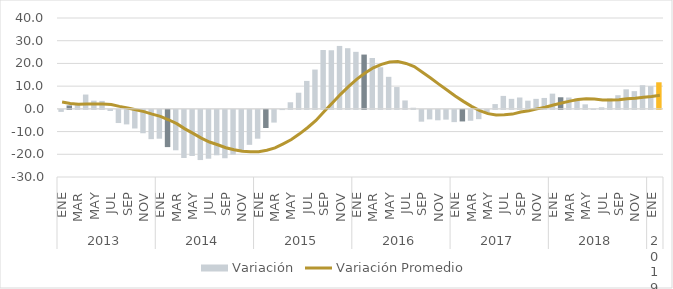
| Category | Variación |
|---|---|
| 0 | -0.9 |
| 1 | 1.5 |
| 2 | 2.5 |
| 3 | 6.3 |
| 4 | 3.6 |
| 5 | 3.5 |
| 6 | -0.5 |
| 7 | -5.8 |
| 8 | -6.4 |
| 9 | -8.2 |
| 10 | -10.3 |
| 11 | -12.9 |
| 12 | -12.7 |
| 13 | -16.4 |
| 14 | -17.8 |
| 15 | -21.2 |
| 16 | -20.3 |
| 17 | -22.1 |
| 18 | -21.5 |
| 19 | -20 |
| 20 | -21.3 |
| 21 | -19.7 |
| 22 | -18.2 |
| 23 | -15.4 |
| 24 | -12.7 |
| 25 | -8 |
| 26 | -5.6 |
| 27 | -0.1 |
| 28 | 2.9 |
| 29 | 7.1 |
| 30 | 12.3 |
| 31 | 17.3 |
| 32 | 25.9 |
| 33 | 25.8 |
| 34 | 27.7 |
| 35 | 26.7 |
| 36 | 25.1 |
| 37 | 23.9 |
| 38 | 22.4 |
| 39 | 18.3 |
| 40 | 14.1 |
| 41 | 9.6 |
| 42 | 3.7 |
| 43 | 0.5 |
| 44 | -5.2 |
| 45 | -4.2 |
| 46 | -4.6 |
| 47 | -4.3 |
| 48 | -5.4 |
| 49 | -5.1 |
| 50 | -4.8 |
| 51 | -4.1 |
| 52 | -1.7 |
| 53 | 2.1 |
| 54 | 5.7 |
| 55 | 4.4 |
| 56 | 5 |
| 57 | 3.6 |
| 58 | 4.4 |
| 59 | 4.8 |
| 60 | 6.7 |
| 61 | 5.1 |
| 62 | 5 |
| 63 | 4.6 |
| 64 | 2 |
| 65 | 0.1 |
| 66 | 0.7 |
| 67 | 4.6 |
| 68 | 6 |
| 69 | 8.6 |
| 70 | 7.8 |
| 71 | 10.4 |
| 72 | 10 |
| 73 | 11.7 |